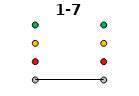
| Category | 0 | 1 | 2 | 3 | 1-7 |
|---|---|---|---|---|---|
| Time 1 | 0 | 1 | 2 | 3 | 0 |
| Time 2 | 0 | 1 | 2 | 3 | 0 |